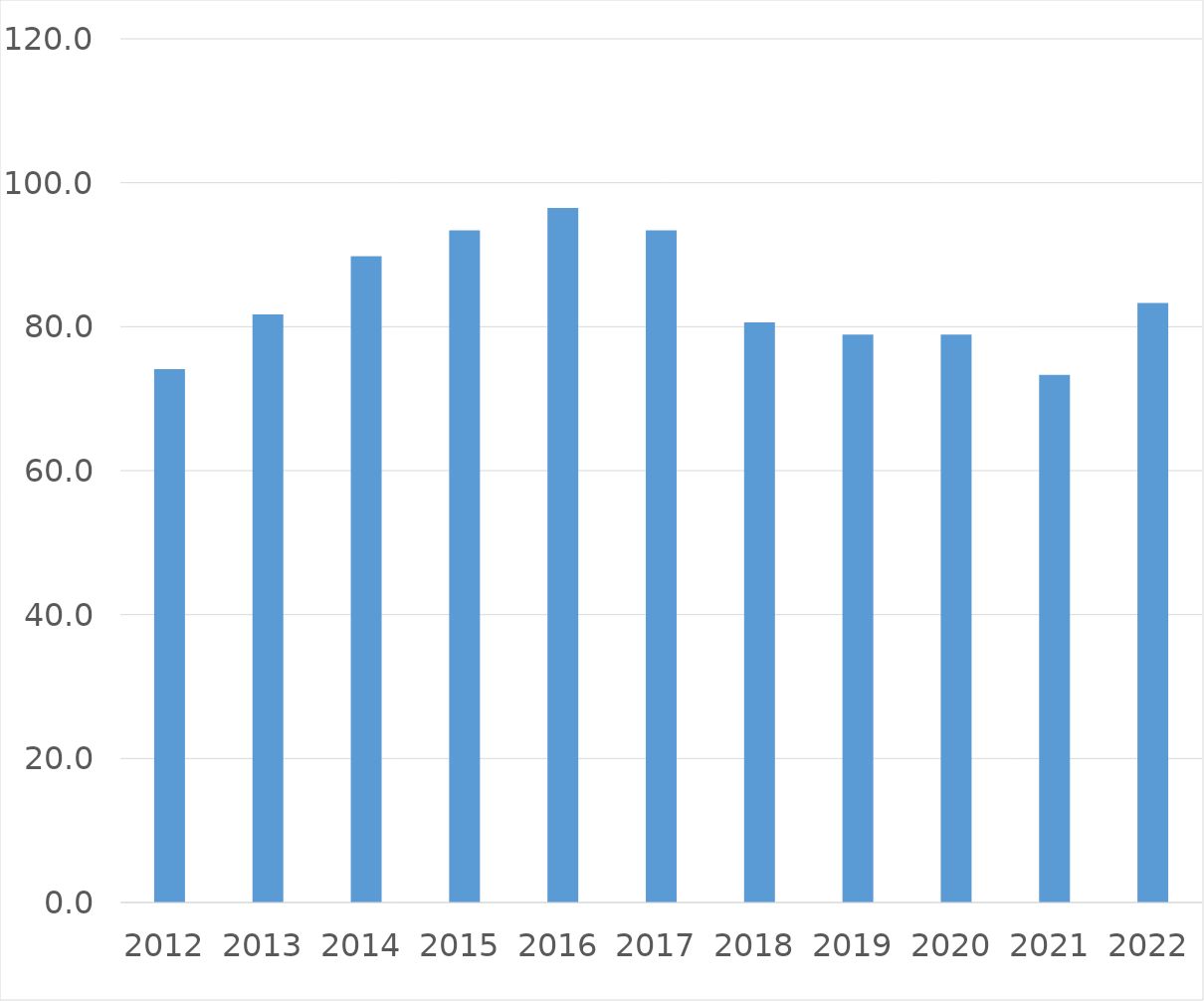
| Category | Series 0 |
|---|---|
| 2012 | 74.1 |
| 2013 | 81.7 |
| 2014 | 89.8 |
| 2015 | 93.4 |
| 2016 | 96.5 |
| 2017 | 93.4 |
| 2018 | 80.6 |
| 2019 | 78.9 |
| 2020 | 78.9 |
| 2021 | 73.3 |
| 2022 | 83.3 |